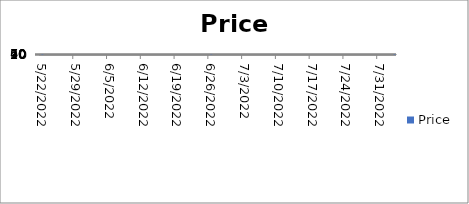
| Category | Price |
|---|---|
| 6/26/22 | 40 |
| 5/22/22 | 50 |
| 8/3/22 | 60 |